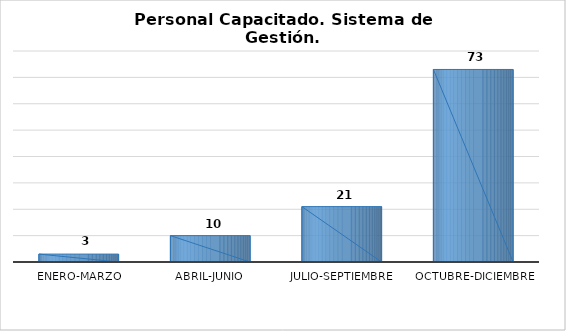
| Category | Personal capacitado/2 |
|---|---|
| Enero-Marzo | 3 |
| Abril-Junio | 10 |
| Julio-Septiembre | 21 |
| Octubre-Diciembre | 73 |